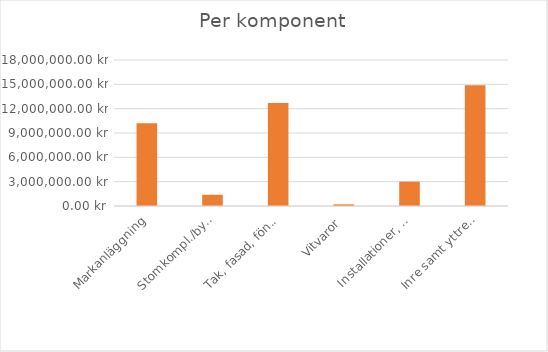
| Category | Series 1 |
|---|---|
| Markanläggning | 10190000 |
| Stomkompl./byggn. Inventarier/inredning | 1380000 |
| Tak, fasad, fönster | 12685000 |
| Vitvaror | 200000 |
| Installationer, el, rör, vent, hiss, kyla | 3000000 |
| Inre samt yttre ytskikt  | 14887452 |